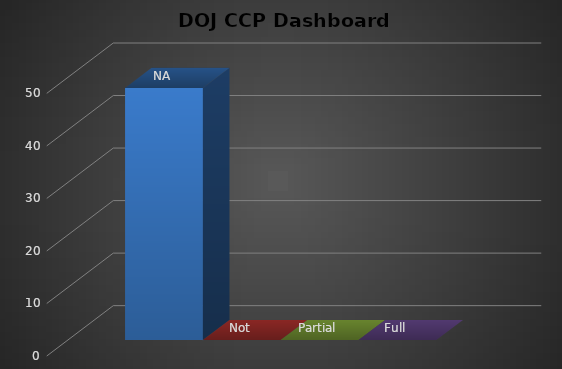
| Category | Series 0 | Series 1 | Series 2 | Series 3 |
|---|---|---|---|---|
| 0 | 48 | 0 | 0 | 0 |